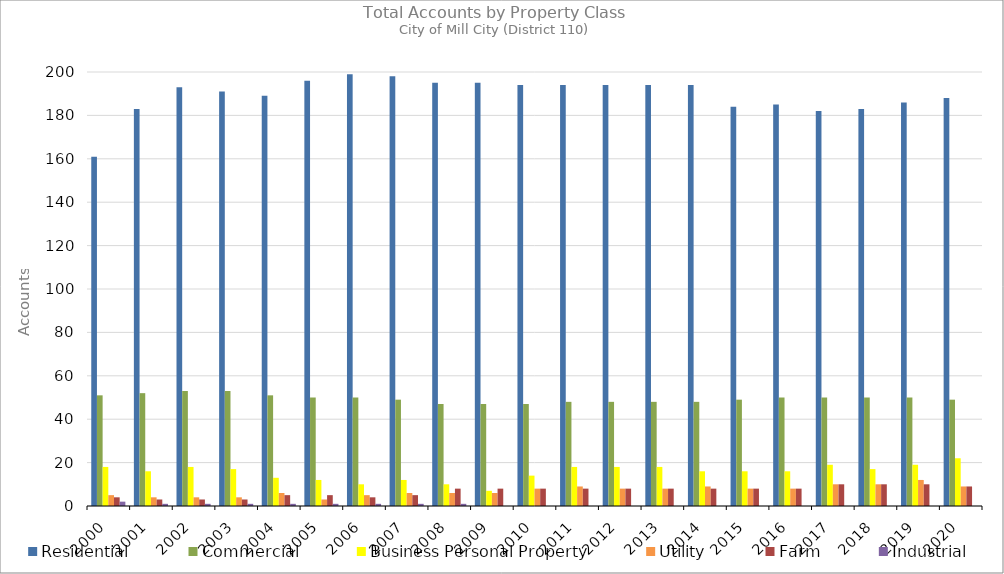
| Category | Residential | Commercial | Business Personal Property | Utility | Farm | Industrial |
|---|---|---|---|---|---|---|
| 2000.0 | 161 | 51 | 18 | 5 | 4 | 2 |
| 2001.0 | 183 | 52 | 16 | 4 | 3 | 1 |
| 2002.0 | 193 | 53 | 18 | 4 | 3 | 1 |
| 2003.0 | 191 | 53 | 17 | 4 | 3 | 1 |
| 2004.0 | 189 | 51 | 13 | 6 | 5 | 1 |
| 2005.0 | 196 | 50 | 12 | 3 | 5 | 1 |
| 2006.0 | 199 | 50 | 10 | 5 | 4 | 1 |
| 2007.0 | 198 | 49 | 12 | 6 | 5 | 1 |
| 2008.0 | 195 | 47 | 10 | 6 | 8 | 1 |
| 2009.0 | 195 | 47 | 7 | 6 | 8 | 0 |
| 2010.0 | 194 | 47 | 14 | 8 | 8 | 0 |
| 2011.0 | 194 | 48 | 18 | 9 | 8 | 0 |
| 2012.0 | 194 | 48 | 18 | 8 | 8 | 0 |
| 2013.0 | 194 | 48 | 18 | 8 | 8 | 0 |
| 2014.0 | 194 | 48 | 16 | 9 | 8 | 0 |
| 2015.0 | 184 | 49 | 16 | 8 | 8 | 0 |
| 2016.0 | 185 | 50 | 16 | 8 | 8 | 0 |
| 2017.0 | 182 | 50 | 19 | 10 | 10 | 0 |
| 2018.0 | 183 | 50 | 17 | 10 | 10 | 0 |
| 2019.0 | 186 | 50 | 19 | 12 | 10 | 0 |
| 2020.0 | 188 | 49 | 22 | 9 | 9 | 0 |